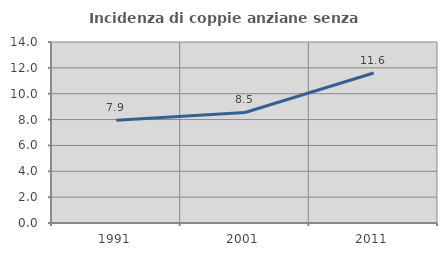
| Category | Incidenza di coppie anziane senza figli  |
|---|---|
| 1991.0 | 7.945 |
| 2001.0 | 8.55 |
| 2011.0 | 11.6 |